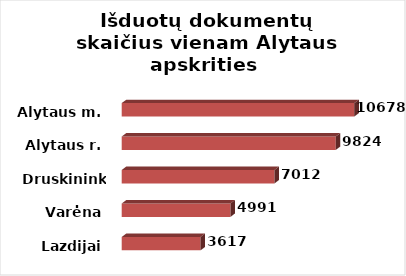
| Category | Series 0 |
|---|---|
| Lazdijai | 3617 |
| Varėna | 4991 |
| Druskininkai | 7012 |
| Alytaus r. | 9824 |
| Alytaus m. | 10678 |